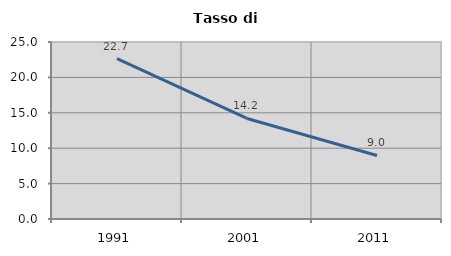
| Category | Tasso di disoccupazione   |
|---|---|
| 1991.0 | 22.667 |
| 2001.0 | 14.198 |
| 2011.0 | 8.974 |